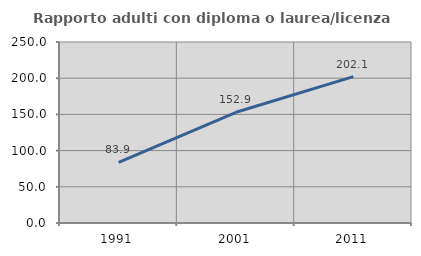
| Category | Rapporto adulti con diploma o laurea/licenza media  |
|---|---|
| 1991.0 | 83.858 |
| 2001.0 | 152.941 |
| 2011.0 | 202.108 |